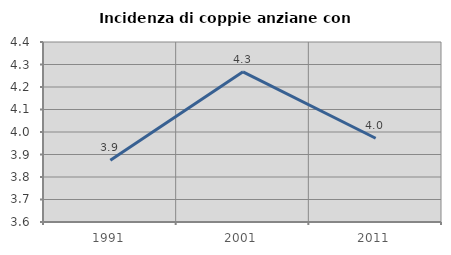
| Category | Incidenza di coppie anziane con figli |
|---|---|
| 1991.0 | 3.874 |
| 2001.0 | 4.267 |
| 2011.0 | 3.972 |